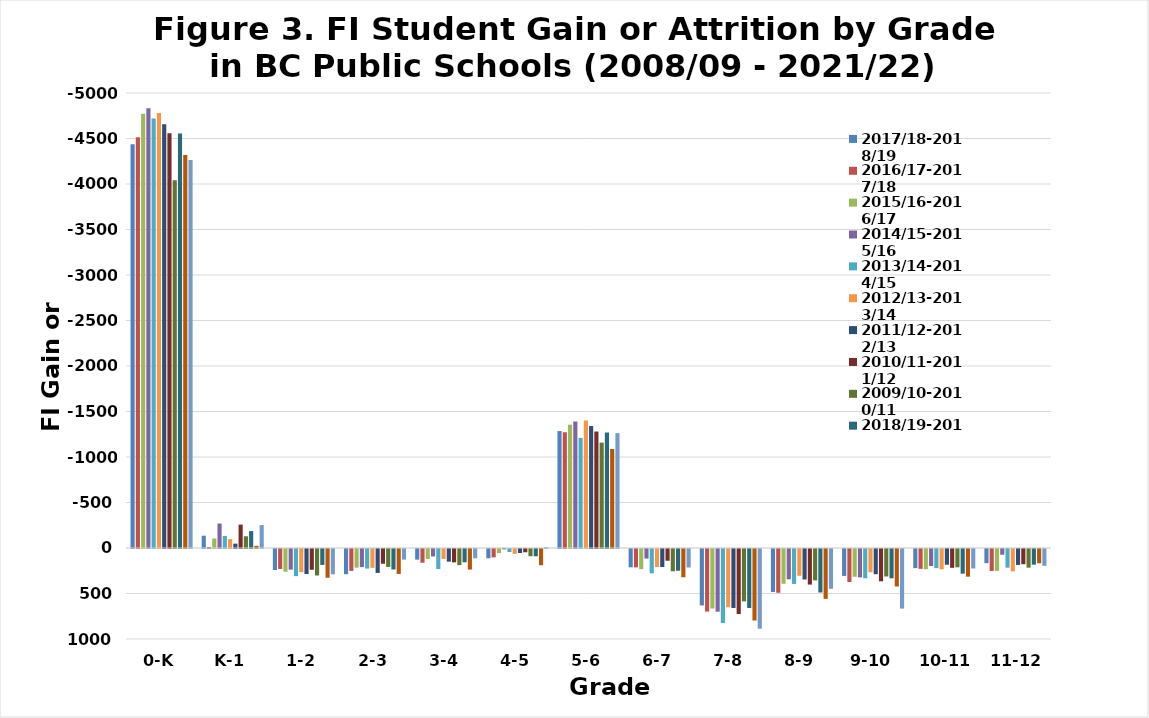
| Category | 2017/18-2018/19 | 2016/17-2017/18 | 2015/16-2016/17 | 2014/15-2015/16 | 2013/14-2014/15 | 2012/13-2013/14 | 2011/12-2012/13 | 2010/11-2011/12 | 2009/10-2010/11 | 2018/19-2019/20 | 2019/20-2020/21 | 2020/21-2021/22 |
|---|---|---|---|---|---|---|---|---|---|---|---|---|
| 0-K | -4437 | -4513 | -4772 | -4833 | -4720 | -4781 | -4657 | -4559 | -4040 | -4554 | -4318 | -4264 |
| K-1 | -135 | -11 | -104 | -269 | -133 | -97 | -48 | -257 | -129 | -186 | -24 | -252 |
| 1-2 | 231 | 219 | 250 | 227 | 298 | 254 | 275 | 228 | 291 | 175 | 316 | 278 |
| 2-3 | 277 | 241 | 205 | 199 | 215 | 207 | 263 | 162 | 197 | 225 | 274 | 117 |
| 3-4 | 117 | 151 | 109 | 82 | 220 | 109 | 139 | 147 | 177 | 146 | 226 | 102 |
| 4-5 | 102 | 92 | 45 | 4 | 33 | 53 | 44 | 36 | 79 | 80 | 178 | -10 |
| 5-6 | -1285 | -1272 | -1355 | -1390 | -1210 | -1402 | -1340 | -1280 | -1158 | -1269 | -1088 | -1262 |
| 6-7 | 201 | 202 | 221 | 105 | 267 | 198 | 198 | 129 | 245 | 239 | 310 | 203 |
| 7-8 | 620 | 688 | 654 | 689 | 814 | 640 | 648 | 715 | 575 | 648 | 786 | 876 |
| 8-9 | 472 | 481 | 382 | 333 | 384 | 294 | 335 | 391 | 345 | 478 | 548 | 437 |
| 9-10 | 296 | 363 | 305 | 312 | 322 | 256 | 277 | 355 | 302 | 322 | 412 | 655 |
| 10-11 | 210 | 218 | 222 | 187 | 210 | 223 | 173 | 207 | 201 | 271 | 304 | 214 |
| 11-12 | 156 | 241 | 241 | 63 | 205 | 246 | 175 | 167 | 205 | 172 | 157 | 185 |